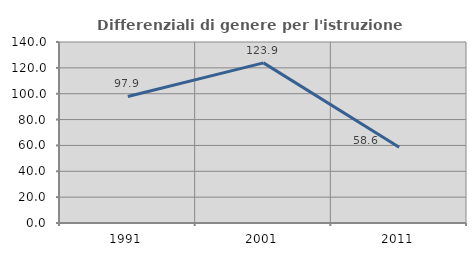
| Category | Differenziali di genere per l'istruzione superiore |
|---|---|
| 1991.0 | 97.907 |
| 2001.0 | 123.854 |
| 2011.0 | 58.578 |